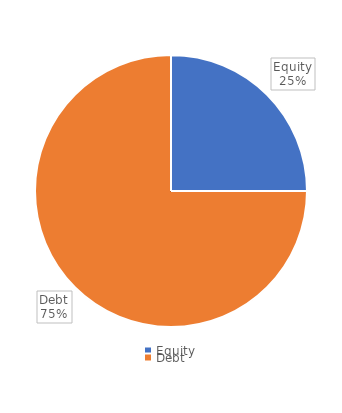
| Category | Series 0 |
|---|---|
| Equity | 0.25 |
| Debt | 0.75 |